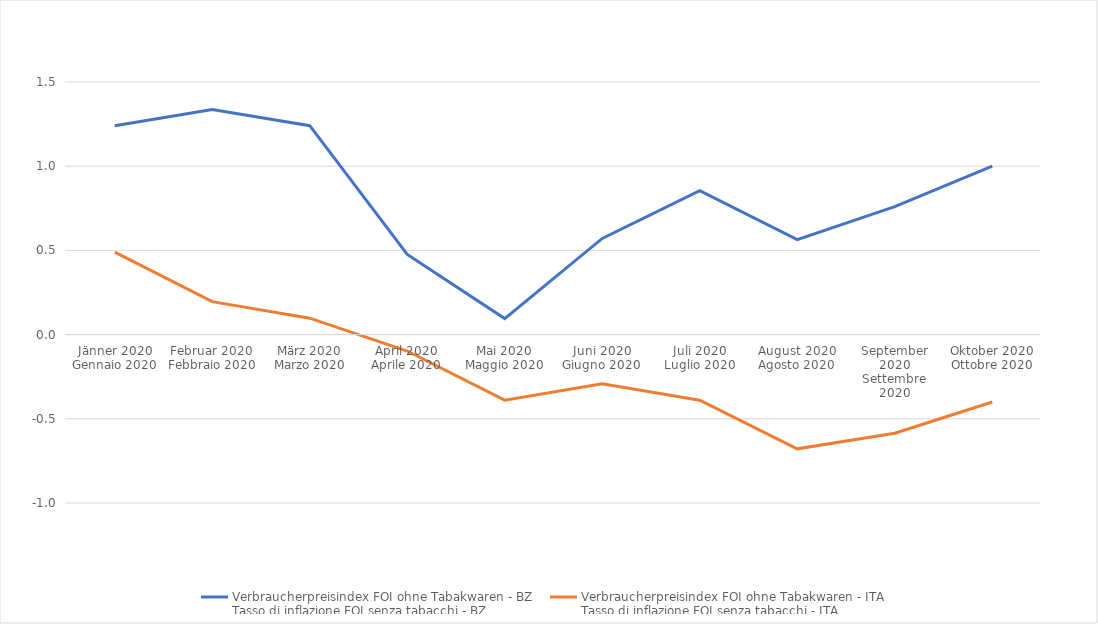
| Category | Verbraucherpreisindex FOI ohne Tabakwaren - BZ
Tasso di inflazione FOI senza tabacchi - BZ | Verbraucherpreisindex FOI ohne Tabakwaren - ITA
Tasso di inflazione FOI senza tabacchi - ITA |
|---|---|---|
| Jänner 2020
Gennaio 2020 | 1.24 | 0.489 |
| Februar 2020
Febbraio 2020 | 1.337 | 0.196 |
| März 2020
Marzo 2020 | 1.24 | 0.098 |
| April 2020
Aprile 2020 | 0.476 | -0.097 |
| Mai 2020
Maggio 2020 | 0.095 | -0.389 |
| Juni 2020
Giugno 2020 | 0.571 | -0.292 |
| Juli 2020
Luglio 2020 | 0.855 | -0.389 |
| August 2020
Agosto 2020 | 0.564 | -0.678 |
| September 2020
Settembre 2020 | 0.76 | -0.585 |
| Oktober 2020
Ottobre 2020 | 1 | -0.4 |